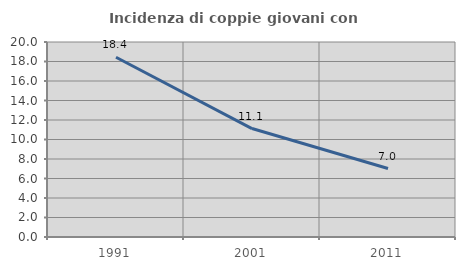
| Category | Incidenza di coppie giovani con figli |
|---|---|
| 1991.0 | 18.435 |
| 2001.0 | 11.122 |
| 2011.0 | 7.019 |